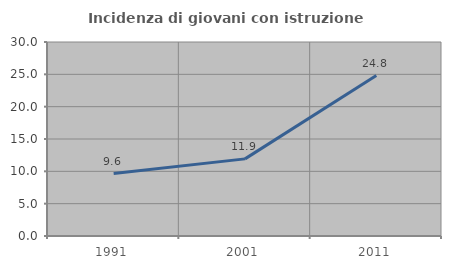
| Category | Incidenza di giovani con istruzione universitaria |
|---|---|
| 1991.0 | 9.649 |
| 2001.0 | 11.927 |
| 2011.0 | 24.812 |